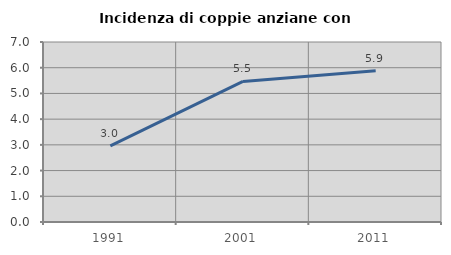
| Category | Incidenza di coppie anziane con figli |
|---|---|
| 1991.0 | 2.96 |
| 2001.0 | 5.466 |
| 2011.0 | 5.882 |